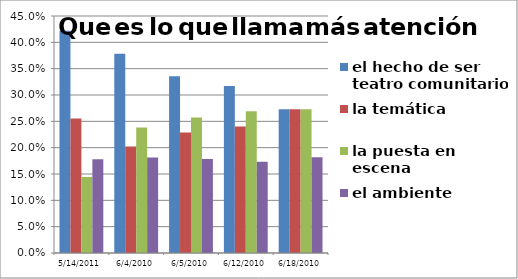
| Category | el hecho de ser  teatro comunitario | la temática | la puesta en escena | el ambiente |
|---|---|---|---|---|
| 14/05/2011 | 0.422 | 0.256 | 0.144 | 0.178 |
| 04/06/2010 | 0.378 | 0.202 | 0.238 | 0.181 |
| 05/06/2010 | 0.336 | 0.229 | 0.257 | 0.179 |
| 12/06/2010 | 0.317 | 0.24 | 0.269 | 0.173 |
| 18/06/2010 | 0.273 | 0.273 | 0.273 | 0.182 |